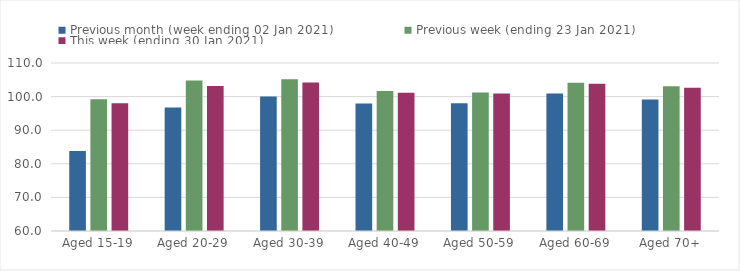
| Category | Previous month (week ending 02 Jan 2021) | Previous week (ending 23 Jan 2021) | This week (ending 30 Jan 2021) |
|---|---|---|---|
| Aged 15-19 | 83.82 | 99.23 | 98.04 |
| Aged 20-29 | 96.79 | 104.77 | 103.16 |
| Aged 30-39 | 100.04 | 105.16 | 104.16 |
| Aged 40-49 | 97.96 | 101.68 | 101.16 |
| Aged 50-59 | 98.02 | 101.25 | 100.89 |
| Aged 60-69 | 100.9 | 104.11 | 103.81 |
| Aged 70+ | 99.16 | 103.1 | 102.65 |